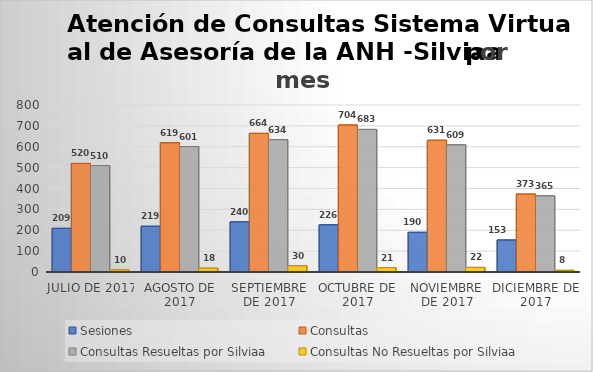
| Category | Sesiones | Consultas | Consultas Resueltas por Silviaa | Consultas No Resueltas por Silviaa |
|---|---|---|---|---|
| Julio de 2017 | 209 | 520 | 510 | 10 |
| Agosto de 2017 | 219 | 619 | 601 | 18 |
| Septiembre de 2017 | 240 | 664 | 634 | 30 |
| Octubre de 2017 | 226 | 704 | 683 | 21 |
| Noviembre de 2017 | 190 | 631 | 609 | 22 |
| Diciembre de 2017 | 153 | 373 | 365 | 8 |